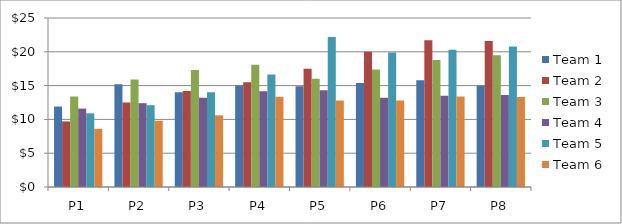
| Category | Team 1 | Team 2 | Team 3 | Team 4 | Team 5 | Team 6 |
|---|---|---|---|---|---|---|
| P1 | 11.9 | 9.7 | 13.4 | 11.6 | 10.9 | 8.6 |
| P2 | 15.2 | 12.5 | 15.9 | 12.4 | 12.1 | 9.8 |
| P3 | 14 | 14.2 | 17.3 | 13.2 | 14 | 10.6 |
| P4 | 15 | 15.5 | 18.1 | 14.17 | 16.63 | 13.36 |
| P5 | 14.9 | 17.5 | 16 | 14.3 | 22.2 | 12.8 |
| P6 | 15.4 | 20 | 17.4 | 13.2 | 19.9 | 12.8 |
| P7 | 15.8 | 21.7 | 18.8 | 13.5 | 20.3 | 13.4 |
| P8 | 15 | 21.6 | 19.5 | 13.6 | 20.8 | 13.3 |